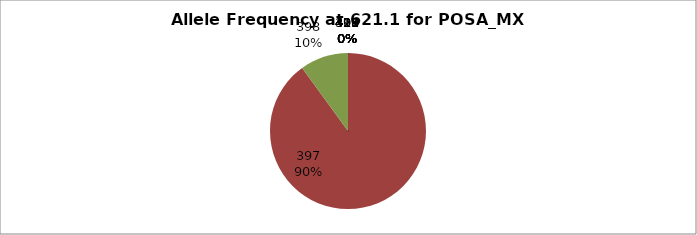
| Category | Series 0 |
|---|---|
| 393.0 | 0 |
| 397.0 | 0.9 |
| 398.0 | 0.1 |
| 399.0 | 0 |
| 400.0 | 0 |
| 413.0 | 0 |
| 415.0 | 0 |
| 417.0 | 0 |
| 418.0 | 0 |
| 419.0 | 0 |
| 421.0 | 0 |
| 423.0 | 0 |
| 425.0 | 0 |